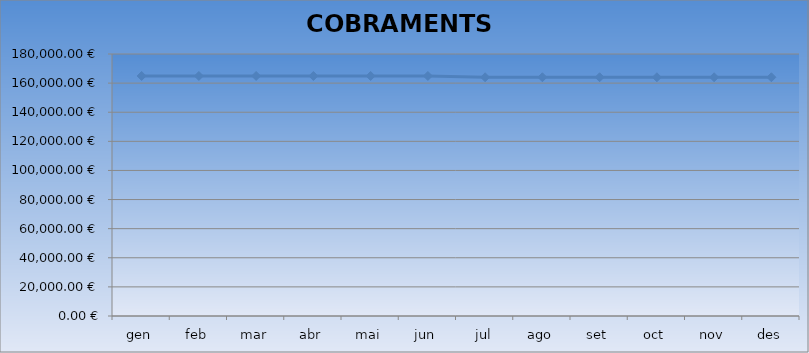
| Category | PREVISIÓ ANUAL COBRAMENTS  2023 | Series 1 |
|---|---|---|
| gen | 164903.34 |  |
| feb | 164903.34 |  |
| mar | 164903.34 |  |
| abr | 164903.34 |  |
| mai | 164903.34 |  |
| jun | 164903.34 |  |
| jul | 164025.84 |  |
| ago | 164025.84 |  |
| set | 164025.84 |  |
| oct | 164025.84 |  |
| nov | 164025.84 |  |
| des | 164025.84 |  |